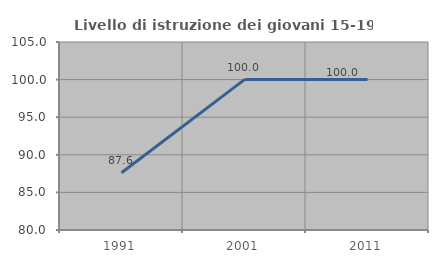
| Category | Livello di istruzione dei giovani 15-19 anni |
|---|---|
| 1991.0 | 87.611 |
| 2001.0 | 100 |
| 2011.0 | 100 |